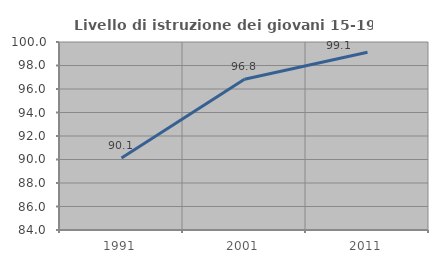
| Category | Livello di istruzione dei giovani 15-19 anni |
|---|---|
| 1991.0 | 90.128 |
| 2001.0 | 96.827 |
| 2011.0 | 99.127 |